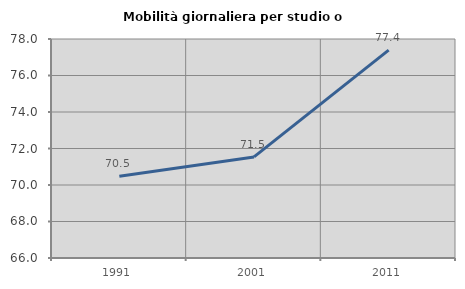
| Category | Mobilità giornaliera per studio o lavoro |
|---|---|
| 1991.0 | 70.474 |
| 2001.0 | 71.538 |
| 2011.0 | 77.389 |